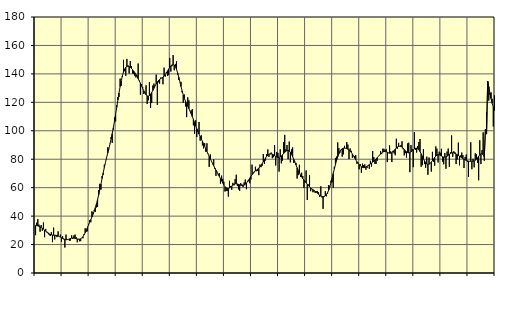
| Category | Piggar | Series 1 |
|---|---|---|
| nan | 26.6 | 33.4 |
| 87.0 | 35.4 | 33.32 |
| 87.0 | 37.9 | 33.13 |
| 87.0 | 34 | 32.82 |
| 87.0 | 29 | 32.47 |
| 87.0 | 33.7 | 32.05 |
| 87.0 | 29.7 | 31.48 |
| 87.0 | 35.5 | 30.85 |
| 87.0 | 25.2 | 30.14 |
| 87.0 | 31 | 29.41 |
| 87.0 | 29.1 | 28.68 |
| 87.0 | 28.5 | 28.03 |
| nan | 26.8 | 27.52 |
| 88.0 | 26 | 27.15 |
| 88.0 | 28.8 | 26.87 |
| 88.0 | 21.7 | 26.69 |
| 88.0 | 31.9 | 26.59 |
| 88.0 | 23.6 | 26.52 |
| 88.0 | 26.8 | 26.42 |
| 88.0 | 25.2 | 26.24 |
| 88.0 | 29.3 | 25.98 |
| 88.0 | 25.6 | 25.64 |
| 88.0 | 27 | 25.21 |
| 88.0 | 22 | 24.73 |
| nan | 25.9 | 24.24 |
| 89.0 | 24.2 | 23.81 |
| 89.0 | 17.9 | 23.51 |
| 89.0 | 27 | 23.39 |
| 89.0 | 23.4 | 23.45 |
| 89.0 | 23.6 | 23.66 |
| 89.0 | 22.7 | 23.97 |
| 89.0 | 22.9 | 24.29 |
| 89.0 | 26.5 | 24.54 |
| 89.0 | 24 | 24.64 |
| 89.0 | 26.4 | 24.57 |
| 89.0 | 27 | 24.39 |
| nan | 25.2 | 24.15 |
| 90.0 | 21.6 | 23.91 |
| 90.0 | 24 | 23.77 |
| 90.0 | 22.3 | 23.8 |
| 90.0 | 22.4 | 24.05 |
| 90.0 | 24.6 | 24.6 |
| 90.0 | 24.4 | 25.51 |
| 90.0 | 27.4 | 26.77 |
| 90.0 | 31.4 | 28.35 |
| 90.0 | 29.1 | 30.12 |
| 90.0 | 29.3 | 31.96 |
| 90.0 | 34.5 | 33.8 |
| nan | 37.2 | 35.63 |
| 91.0 | 35.7 | 37.46 |
| 91.0 | 43.3 | 39.34 |
| 91.0 | 42.8 | 41.33 |
| 91.0 | 44.2 | 43.5 |
| 91.0 | 43 | 45.92 |
| 91.0 | 46.1 | 48.62 |
| 91.0 | 46.5 | 51.65 |
| 91.0 | 58.3 | 54.98 |
| 91.0 | 62.7 | 58.62 |
| 91.0 | 58.7 | 62.49 |
| 91.0 | 68.2 | 66.46 |
| nan | 69.1 | 70.41 |
| 92.0 | 76.2 | 74.2 |
| 92.0 | 77.8 | 77.77 |
| 92.0 | 81.3 | 81.11 |
| 92.0 | 88.4 | 84.29 |
| 92.0 | 87 | 87.44 |
| 92.0 | 90.9 | 90.72 |
| 92.0 | 95.6 | 94.2 |
| 92.0 | 91.5 | 97.97 |
| 92.0 | 100.8 | 102.1 |
| 92.0 | 109.3 | 106.61 |
| 92.0 | 106.5 | 111.45 |
| nan | 117.9 | 116.51 |
| 93.0 | 123.7 | 121.6 |
| 93.0 | 123.7 | 126.52 |
| 93.0 | 136.7 | 131.09 |
| 93.0 | 131.6 | 135.14 |
| 93.0 | 137.8 | 138.57 |
| 93.0 | 149.9 | 141.32 |
| 93.0 | 141.9 | 143.36 |
| 93.0 | 138.6 | 144.65 |
| 93.0 | 150.5 | 145.29 |
| 93.0 | 146 | 145.41 |
| 93.0 | 140.3 | 145.15 |
| nan | 149 | 144.62 |
| 94.0 | 145.5 | 143.89 |
| 94.0 | 140.3 | 143 |
| 94.0 | 140 | 141.98 |
| 94.0 | 138.6 | 140.83 |
| 94.0 | 137.5 | 139.59 |
| 94.0 | 139 | 138.19 |
| 94.0 | 147.3 | 136.64 |
| 94.0 | 135.3 | 135.06 |
| 94.0 | 125.4 | 133.4 |
| 94.0 | 132.9 | 131.64 |
| 94.0 | 130.9 | 129.85 |
| nan | 125.9 | 128.1 |
| 95.0 | 126.7 | 126.5 |
| 95.0 | 132 | 125.25 |
| 95.0 | 118.8 | 124.52 |
| 95.0 | 121.4 | 124.36 |
| 95.0 | 134.3 | 124.76 |
| 95.0 | 116 | 125.65 |
| 95.0 | 119.5 | 126.88 |
| 95.0 | 131.8 | 128.32 |
| 95.0 | 133.2 | 129.91 |
| 95.0 | 131.8 | 131.53 |
| 95.0 | 139.5 | 133.03 |
| nan | 118.2 | 134.3 |
| 96.0 | 134.1 | 135.31 |
| 96.0 | 133.1 | 136.08 |
| 96.0 | 137.4 | 136.64 |
| 96.0 | 137.3 | 137.17 |
| 96.0 | 132.7 | 137.74 |
| 96.0 | 144.4 | 138.45 |
| 96.0 | 138 | 139.43 |
| 96.0 | 141.3 | 140.64 |
| 96.0 | 138.5 | 141.99 |
| 96.0 | 139.1 | 143.35 |
| 96.0 | 151.2 | 144.62 |
| nan | 141.6 | 145.65 |
| 97.0 | 145.4 | 146.32 |
| 97.0 | 153.2 | 146.51 |
| 97.0 | 142.5 | 146.13 |
| 97.0 | 147 | 145.06 |
| 97.0 | 148.8 | 143.26 |
| 97.0 | 139.5 | 140.78 |
| 97.0 | 135.7 | 137.77 |
| 97.0 | 134.4 | 134.46 |
| 97.0 | 134.4 | 131.11 |
| 97.0 | 127 | 127.99 |
| 97.0 | 119.7 | 125.2 |
| nan | 125.5 | 122.8 |
| 98.0 | 117.1 | 120.78 |
| 98.0 | 109.6 | 118.98 |
| 98.0 | 123.5 | 117.28 |
| 98.0 | 121.4 | 115.6 |
| 98.0 | 113.8 | 113.84 |
| 98.0 | 114.3 | 111.98 |
| 98.0 | 115.2 | 110.02 |
| 98.0 | 103.8 | 107.95 |
| 98.0 | 97.9 | 105.77 |
| 98.0 | 107.3 | 103.56 |
| 98.0 | 95.6 | 101.46 |
| nan | 100.6 | 99.49 |
| 99.0 | 106.2 | 97.67 |
| 99.0 | 93 | 95.98 |
| 99.0 | 96.8 | 94.32 |
| 99.0 | 89.7 | 92.59 |
| 99.0 | 87.6 | 90.81 |
| 99.0 | 91.3 | 89.01 |
| 99.0 | 85.2 | 87.19 |
| 99.0 | 91.2 | 85.38 |
| 99.0 | 83.9 | 83.66 |
| 99.0 | 74.6 | 82 |
| 99.0 | 83.4 | 80.34 |
| nan | 78.7 | 78.67 |
| 0.0 | 76.5 | 77 |
| 0.0 | 79.9 | 75.36 |
| 0.0 | 73.1 | 73.8 |
| 0.0 | 68.3 | 72.33 |
| 0.0 | 71.2 | 70.9 |
| 0.0 | 68.8 | 69.42 |
| 0.0 | 70.2 | 67.89 |
| 0.0 | 62.8 | 66.32 |
| 0.0 | 68.5 | 64.74 |
| 0.0 | 66.2 | 63.24 |
| 0.0 | 64.2 | 61.87 |
| nan | 57.3 | 60.71 |
| 1.0 | 57.6 | 59.87 |
| 1.0 | 57.7 | 59.44 |
| 1.0 | 53.7 | 59.42 |
| 1.0 | 64.8 | 59.77 |
| 1.0 | 61.2 | 60.39 |
| 1.0 | 58.5 | 61.13 |
| 1.0 | 63.4 | 61.82 |
| 1.0 | 61.6 | 62.36 |
| 1.0 | 66 | 62.69 |
| 1.0 | 69.1 | 62.74 |
| 1.0 | 61.1 | 62.59 |
| nan | 58.8 | 62.32 |
| 2.0 | 57.8 | 62 |
| 2.0 | 63.2 | 61.71 |
| 2.0 | 62.3 | 61.54 |
| 2.0 | 60.4 | 61.56 |
| 2.0 | 63.7 | 61.81 |
| 2.0 | 65.7 | 62.35 |
| 2.0 | 58.9 | 63.21 |
| 2.0 | 64.8 | 64.29 |
| 2.0 | 64.5 | 65.5 |
| 2.0 | 63.1 | 66.74 |
| 2.0 | 65.7 | 67.92 |
| nan | 76.2 | 69.04 |
| 3.0 | 70.8 | 70.08 |
| 3.0 | 71.4 | 71 |
| 3.0 | 74.7 | 71.76 |
| 3.0 | 71.6 | 72.43 |
| 3.0 | 71.7 | 73.08 |
| 3.0 | 68.8 | 73.77 |
| 3.0 | 76.3 | 74.61 |
| 3.0 | 74.4 | 75.66 |
| 3.0 | 75.3 | 76.88 |
| 3.0 | 83.6 | 78.24 |
| 3.0 | 76.7 | 79.63 |
| nan | 79.1 | 80.92 |
| 4.0 | 83.6 | 82.04 |
| 4.0 | 86.9 | 82.91 |
| 4.0 | 81.6 | 83.49 |
| 4.0 | 83.4 | 83.79 |
| 4.0 | 84.7 | 83.79 |
| 4.0 | 80.7 | 83.53 |
| 4.0 | 81.4 | 83.08 |
| 4.0 | 89.9 | 82.5 |
| 4.0 | 75.6 | 81.95 |
| 4.0 | 85.1 | 81.51 |
| 4.0 | 84.4 | 81.29 |
| nan | 71.3 | 81.38 |
| 5.0 | 87 | 81.73 |
| 5.0 | 77.1 | 82.31 |
| 5.0 | 79 | 83.07 |
| 5.0 | 92.1 | 83.95 |
| 5.0 | 97.1 | 84.86 |
| 5.0 | 86.9 | 85.66 |
| 5.0 | 90 | 86.17 |
| 5.0 | 80 | 86.26 |
| 5.0 | 92.4 | 85.83 |
| 5.0 | 77.8 | 84.89 |
| 5.0 | 86.9 | 83.52 |
| nan | 88.3 | 81.83 |
| 6.0 | 77.4 | 79.92 |
| 6.0 | 78.3 | 77.91 |
| 6.0 | 77.4 | 75.93 |
| 6.0 | 66.4 | 73.99 |
| 6.0 | 68.8 | 72.11 |
| 6.0 | 76.1 | 70.4 |
| 6.0 | 67.6 | 68.88 |
| 6.0 | 70.5 | 67.55 |
| 6.0 | 68.2 | 66.42 |
| 6.0 | 59.9 | 65.38 |
| 6.0 | 63.8 | 64.41 |
| nan | 72.1 | 63.43 |
| 7.0 | 51.3 | 62.44 |
| 7.0 | 62.3 | 61.47 |
| 7.0 | 68.7 | 60.56 |
| 7.0 | 57.5 | 59.78 |
| 7.0 | 58.9 | 59.16 |
| 7.0 | 56.8 | 58.59 |
| 7.0 | 57.3 | 58.02 |
| 7.0 | 56.2 | 57.43 |
| 7.0 | 57.5 | 56.78 |
| 7.0 | 57.7 | 56.1 |
| 7.0 | 56.8 | 55.39 |
| nan | 53.5 | 54.72 |
| 8.0 | 61 | 54.18 |
| 8.0 | 53.1 | 53.87 |
| 8.0 | 45.1 | 53.74 |
| 8.0 | 54.1 | 53.84 |
| 8.0 | 57.5 | 54.29 |
| 8.0 | 53.9 | 55.15 |
| 8.0 | 55.7 | 56.48 |
| 8.0 | 61.8 | 58.32 |
| 8.0 | 61.1 | 60.66 |
| 8.0 | 64.9 | 63.47 |
| 8.0 | 63.8 | 66.6 |
| nan | 59.9 | 69.9 |
| 9.0 | 74.7 | 73.18 |
| 9.0 | 80.9 | 76.28 |
| 9.0 | 81.9 | 79.15 |
| 9.0 | 91.8 | 81.71 |
| 9.0 | 87.8 | 83.82 |
| 9.0 | 84.6 | 85.46 |
| 9.0 | 86.9 | 86.64 |
| 9.0 | 81.8 | 87.38 |
| 9.0 | 83.4 | 87.71 |
| 9.0 | 89.4 | 87.77 |
| 9.0 | 87.6 | 87.64 |
| nan | 92.1 | 87.41 |
| 10.0 | 90.3 | 87.07 |
| 10.0 | 80.1 | 86.55 |
| 10.0 | 87.6 | 85.82 |
| 10.0 | 85.9 | 84.85 |
| 10.0 | 81.1 | 83.66 |
| 10.0 | 82.2 | 82.3 |
| 10.0 | 82.1 | 80.89 |
| 10.0 | 82.9 | 79.53 |
| 10.0 | 76.8 | 78.3 |
| 10.0 | 77.7 | 77.2 |
| 10.0 | 72.9 | 76.24 |
| nan | 76.6 | 75.41 |
| 11.0 | 70.4 | 74.72 |
| 11.0 | 76.9 | 74.27 |
| 11.0 | 75.8 | 74.11 |
| 11.0 | 76.4 | 74.21 |
| 11.0 | 72.6 | 74.54 |
| 11.0 | 73.9 | 75.03 |
| 11.0 | 75.3 | 75.6 |
| 11.0 | 73.3 | 76.18 |
| 11.0 | 78.9 | 76.75 |
| 11.0 | 74.8 | 77.33 |
| 11.0 | 85.8 | 77.93 |
| nan | 81.5 | 78.58 |
| 12.0 | 76.7 | 79.33 |
| 12.0 | 76.7 | 80.18 |
| 12.0 | 78.9 | 81.05 |
| 12.0 | 82 | 81.93 |
| 12.0 | 82.7 | 82.82 |
| 12.0 | 85.8 | 83.67 |
| 12.0 | 83.6 | 84.44 |
| 12.0 | 87.4 | 85.04 |
| 12.0 | 87.3 | 85.4 |
| 12.0 | 86.3 | 85.46 |
| 12.0 | 87.1 | 85.25 |
| nan | 78 | 84.87 |
| 13.0 | 84.3 | 84.49 |
| 13.0 | 89.7 | 84.25 |
| 13.0 | 85.5 | 84.25 |
| 13.0 | 78 | 84.56 |
| 13.0 | 85.9 | 85.18 |
| 13.0 | 84.1 | 86.06 |
| 13.0 | 82.8 | 87.02 |
| 13.0 | 94.4 | 87.88 |
| 13.0 | 87.4 | 88.59 |
| 13.0 | 91.5 | 89.03 |
| 13.0 | 89.3 | 89.16 |
| nan | 89.9 | 89 |
| 14.0 | 92.6 | 88.53 |
| 14.0 | 87 | 87.77 |
| 14.0 | 82.7 | 86.85 |
| 14.0 | 84.2 | 85.96 |
| 14.0 | 81.1 | 85.22 |
| 14.0 | 91.1 | 84.68 |
| 14.0 | 91.6 | 84.49 |
| 14.0 | 70.9 | 84.68 |
| 14.0 | 90 | 85.17 |
| 14.0 | 87 | 85.86 |
| 14.0 | 74.4 | 86.62 |
| nan | 99.1 | 87.27 |
| 15.0 | 86.6 | 87.68 |
| 15.0 | 84.7 | 87.73 |
| 15.0 | 89.3 | 87.36 |
| 15.0 | 92.1 | 86.59 |
| 15.0 | 94.2 | 85.38 |
| 15.0 | 74.7 | 83.83 |
| 15.0 | 75.8 | 82.09 |
| 15.0 | 87.1 | 80.35 |
| 15.0 | 76.6 | 78.78 |
| 15.0 | 74 | 77.52 |
| 15.0 | 81.8 | 76.72 |
| nan | 69.1 | 76.41 |
| 16.0 | 81.2 | 76.51 |
| 16.0 | 77.2 | 77.05 |
| 16.0 | 71.3 | 77.94 |
| 16.0 | 85.2 | 79.02 |
| 16.0 | 78.1 | 80.16 |
| 16.0 | 75.5 | 81.26 |
| 16.0 | 89 | 82.19 |
| 16.0 | 87.4 | 82.85 |
| 16.0 | 77.7 | 83.16 |
| 16.0 | 85.3 | 83.1 |
| 16.0 | 84.5 | 82.76 |
| nan | 87.3 | 82.26 |
| 17.0 | 78.3 | 81.77 |
| 17.0 | 76.4 | 81.44 |
| 17.0 | 84.4 | 81.41 |
| 17.0 | 73.3 | 81.66 |
| 17.0 | 85.4 | 82.13 |
| 17.0 | 87.5 | 82.78 |
| 17.0 | 74.6 | 83.46 |
| 17.0 | 84.9 | 83.99 |
| 17.0 | 96.7 | 84.37 |
| 17.0 | 81.7 | 84.55 |
| 17.0 | 85.6 | 84.46 |
| nan | 84.9 | 84.11 |
| 18.0 | 76.6 | 83.65 |
| 18.0 | 79.8 | 83.18 |
| 18.0 | 91.7 | 82.64 |
| 18.0 | 75.7 | 82.08 |
| 18.0 | 82.7 | 81.53 |
| 18.0 | 84.7 | 81.01 |
| 18.0 | 83 | 80.51 |
| 18.0 | 73.8 | 80.04 |
| 18.0 | 81.6 | 79.55 |
| 18.0 | 83.3 | 79.15 |
| 18.0 | 78.2 | 78.86 |
| nan | 67.5 | 78.68 |
| 19.0 | 78.5 | 78.61 |
| 19.0 | 91.9 | 78.56 |
| 19.0 | 73 | 78.54 |
| 19.0 | 80.3 | 78.6 |
| 19.0 | 74.3 | 78.8 |
| 19.0 | 84.2 | 79.23 |
| 19.0 | 83.5 | 79.97 |
| 19.0 | 77.4 | 80.99 |
| 19.0 | 65.2 | 82.12 |
| 19.0 | 93.3 | 83.09 |
| 19.0 | 76.6 | 83.75 |
| nan | 86.4 | 83.85 |
| 20.0 | 98.9 | 83.16 |
| 20.0 | 78.9 | 81.56 |
| 20.0 | 100.3 | 100.95 |
| 20.0 | 113.2 | 97.68 |
| 20.0 | 123.5 | 134.9 |
| 20.0 | 121.2 | 130.77 |
| 20.0 | 125.4 | 126.58 |
| 20.0 | 127 | 122.66 |
| 20.0 | 122.5 | 119.25 |
| 20.0 | 103.1 | 116.43 |
| 20.0 | 124.8 | 114.13 |